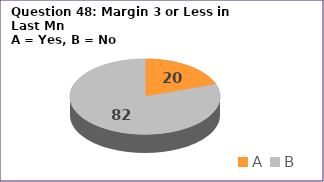
| Category | Series 0 |
|---|---|
| A | 20 |
| B | 82 |